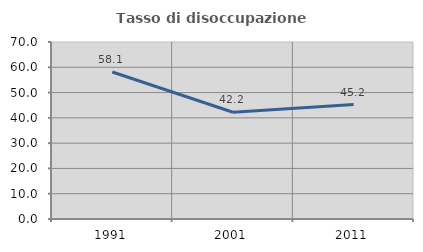
| Category | Tasso di disoccupazione giovanile  |
|---|---|
| 1991.0 | 58.147 |
| 2001.0 | 42.227 |
| 2011.0 | 45.236 |